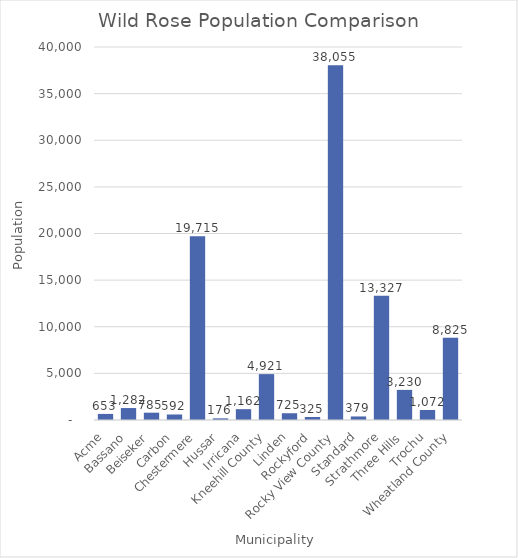
| Category | Population |
|---|---|
| Acme | 653 |
| Bassano | 1282 |
| Beiseker | 785 |
| Carbon | 592 |
| Chestermere | 19715 |
| Hussar | 176 |
| Irricana | 1162 |
| Kneehill County | 4921 |
| Linden | 725 |
| Rockyford | 325 |
| Rocky View County | 38055 |
| Standard | 379 |
| Strathmore | 13327 |
| Three Hills | 3230 |
| Trochu | 1072 |
| Wheatland County | 8825 |